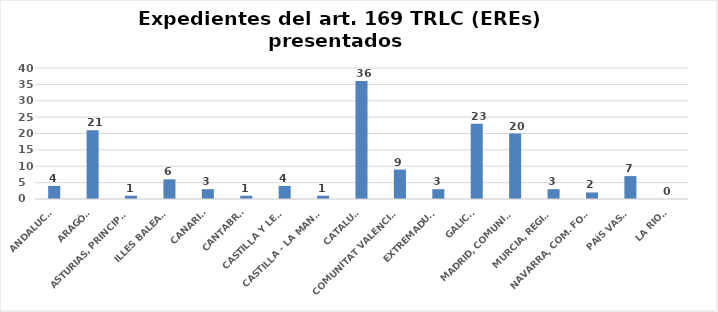
| Category | Series 0 |
|---|---|
| ANDALUCÍA | 4 |
| ARAGÓN | 21 |
| ASTURIAS, PRINCIPADO | 1 |
| ILLES BALEARS | 6 |
| CANARIAS | 3 |
| CANTABRIA | 1 |
| CASTILLA Y LEÓN | 4 |
| CASTILLA - LA MANCHA | 1 |
| CATALUÑA | 36 |
| COMUNITAT VALENCIANA | 9 |
| EXTREMADURA | 3 |
| GALICIA | 23 |
| MADRID, COMUNIDAD | 20 |
| MURCIA, REGIÓN | 3 |
| NAVARRA, COM. FORAL | 2 |
| PAÍS VASCO | 7 |
| LA RIOJA | 0 |